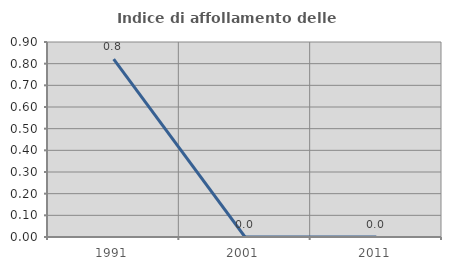
| Category | Indice di affollamento delle abitazioni  |
|---|---|
| 1991.0 | 0.821 |
| 2001.0 | 0 |
| 2011.0 | 0 |